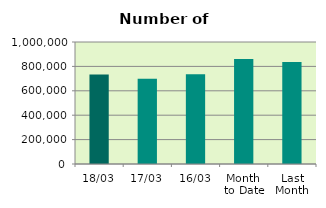
| Category | Series 0 |
|---|---|
| 18/03 | 733948 |
| 17/03 | 697760 |
| 16/03 | 735522 |
| Month 
to Date | 860149.571 |
| Last
Month | 836497.7 |